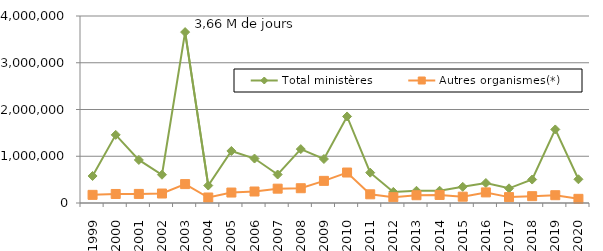
| Category | Total ministères | Autres organismes(*) |
|---|---|---|
| 1999.0 | 577709 | 174138 |
| 2000.0 | 1457379 | 192959 |
| 2001.0 | 921115 | 194216 |
| 2002.0 | 604864 | 202627 |
| 2003.0 | 3655483 | 404272 |
| 2004.0 | 373891 | 117759 |
| 2005.0 | 1113155 | 223881 |
| 2006.0 | 950984 | 245924 |
| 2007.0 | 609621 | 306669 |
| 2008.0 | 1153009 | 316094 |
| 2009.0 | 941176 | 473350 |
| 2010.0 | 1851083 | 651822 |
| 2011.0 | 648934 | 186163 |
| 2012.0 | 237237 | 124996 |
| 2013.0 | 261067 | 166055 |
| 2014.0 | 262482 | 172350 |
| 2015.0 | 345387 | 135042 |
| 2016.0 | 427292 | 226789 |
| 2017.0 | 313775 | 126046 |
| 2018.0 | 501953 | 146049 |
| 2019.0 | 1573259 | 166638 |
| 2020.0 | 507562 | 89230 |